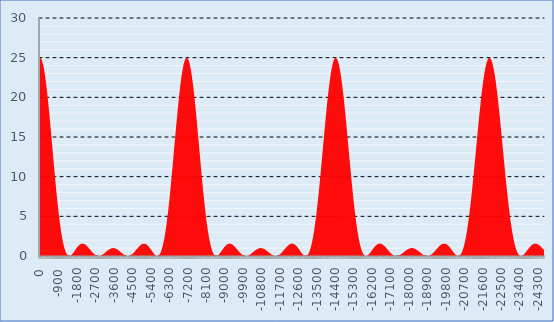
| Category | Series 0 |
|---|---|
| 0.0 | 24.999 |
| -50.0 | 24.903 |
| -100.0 | 24.615 |
| -150.0 | 24.141 |
| -200.0 | 23.489 |
| -250.0 | 22.671 |
| -300.0 | 21.702 |
| -350.0 | 20.599 |
| -400.0 | 19.38 |
| -450.0 | 18.068 |
| -500.0 | 16.683 |
| -550.0 | 15.249 |
| -600.0 | 13.789 |
| -650.0 | 12.325 |
| -700.0 | 10.879 |
| -750.0 | 9.473 |
| -800.0 | 8.124 |
| -850.0 | 6.85 |
| -900.0 | 5.666 |
| -950.0 | 4.583 |
| -1000.0 | 3.611 |
| -1050.0 | 2.756 |
| -1100.0 | 2.022 |
| -1150.0 | 1.41 |
| -1200.0 | 0.916 |
| -1250.0 | 0.537 |
| -1300.0 | 0.267 |
| -1350.0 | 0.095 |
| -1400.0 | 0.012 |
| -1450.0 | 0.007 |
| -1500.0 | 0.065 |
| -1550.0 | 0.175 |
| -1600.0 | 0.323 |
| -1650.0 | 0.497 |
| -1700.0 | 0.683 |
| -1750.0 | 0.87 |
| -1800.0 | 1.049 |
| -1850.0 | 1.21 |
| -1900.0 | 1.346 |
| -1950.0 | 1.452 |
| -2000.0 | 1.523 |
| -2050.0 | 1.559 |
| -2100.0 | 1.558 |
| -2150.0 | 1.521 |
| -2200.0 | 1.452 |
| -2250.0 | 1.355 |
| -2300.0 | 1.234 |
| -2350.0 | 1.095 |
| -2400.0 | 0.944 |
| -2450.0 | 0.787 |
| -2500.0 | 0.632 |
| -2550.0 | 0.484 |
| -2600.0 | 0.349 |
| -2650.0 | 0.231 |
| -2700.0 | 0.135 |
| -2750.0 | 0.063 |
| -2800.0 | 0.018 |
| -2850.0 | 0 |
| -2900.0 | 0.009 |
| -2950.0 | 0.043 |
| -3000.0 | 0.1 |
| -3050.0 | 0.176 |
| -3100.0 | 0.268 |
| -3150.0 | 0.37 |
| -3200.0 | 0.478 |
| -3250.0 | 0.586 |
| -3300.0 | 0.69 |
| -3350.0 | 0.785 |
| -3400.0 | 0.867 |
| -3450.0 | 0.931 |
| -3500.0 | 0.975 |
| -3550.0 | 0.997 |
| -3600.0 | 0.997 |
| -3650.0 | 0.973 |
| -3700.0 | 0.928 |
| -3750.0 | 0.863 |
| -3800.0 | 0.781 |
| -3850.0 | 0.685 |
| -3900.0 | 0.581 |
| -3950.0 | 0.472 |
| -4000.0 | 0.365 |
| -4050.0 | 0.263 |
| -4100.0 | 0.172 |
| -4150.0 | 0.097 |
| -4200.0 | 0.041 |
| -4250.0 | 0.008 |
| -4300.0 | 0.001 |
| -4350.0 | 0.02 |
| -4400.0 | 0.066 |
| -4450.0 | 0.138 |
| -4500.0 | 0.235 |
| -4550.0 | 0.353 |
| -4600.0 | 0.488 |
| -4650.0 | 0.636 |
| -4700.0 | 0.791 |
| -4750.0 | 0.947 |
| -4800.0 | 1.097 |
| -4850.0 | 1.236 |
| -4900.0 | 1.356 |
| -4950.0 | 1.453 |
| -5000.0 | 1.522 |
| -5050.0 | 1.558 |
| -5100.0 | 1.559 |
| -5150.0 | 1.523 |
| -5200.0 | 1.452 |
| -5250.0 | 1.347 |
| -5300.0 | 1.212 |
| -5350.0 | 1.052 |
| -5400.0 | 0.874 |
| -5450.0 | 0.687 |
| -5500.0 | 0.502 |
| -5550.0 | 0.329 |
| -5600.0 | 0.18 |
| -5650.0 | 0.069 |
| -5700.0 | 0.008 |
| -5750.0 | 0.01 |
| -5800.0 | 0.088 |
| -5850.0 | 0.254 |
| -5900.0 | 0.517 |
| -5950.0 | 0.886 |
| -6000.0 | 1.369 |
| -6050.0 | 1.969 |
| -6100.0 | 2.69 |
| -6150.0 | 3.529 |
| -6200.0 | 4.485 |
| -6250.0 | 5.552 |
| -6300.0 | 6.719 |
| -6350.0 | 7.976 |
| -6400.0 | 9.309 |
| -6450.0 | 10.701 |
| -6500.0 | 12.134 |
| -6550.0 | 13.587 |
| -6600.0 | 15.04 |
| -6650.0 | 16.47 |
| -6700.0 | 17.854 |
| -6750.0 | 19.171 |
| -6800.0 | 20.399 |
| -6850.0 | 21.516 |
| -6900.0 | 22.503 |
| -6950.0 | 23.345 |
| -7000.0 | 24.025 |
| -7050.0 | 24.532 |
| -7100.0 | 24.857 |
| -7150.0 | 24.995 |
| -7200.0 | 24.942 |
| -7250.0 | 24.7 |
| -7300.0 | 24.273 |
| -7350.0 | 23.67 |
| -7400.0 | 22.9 |
| -7450.0 | 21.977 |
| -7500.0 | 20.917 |
| -7550.0 | 19.739 |
| -7600.0 | 18.462 |
| -7650.0 | 17.108 |
| -7700.0 | 15.7 |
| -7750.0 | 14.258 |
| -7800.0 | 12.806 |
| -7850.0 | 11.365 |
| -7900.0 | 9.956 |
| -7950.0 | 8.597 |
| -8000.0 | 7.307 |
| -8050.0 | 6.099 |
| -8100.0 | 4.988 |
| -8150.0 | 3.981 |
| -8200.0 | 3.088 |
| -8250.0 | 2.312 |
| -8300.0 | 1.655 |
| -8350.0 | 1.116 |
| -8400.0 | 0.692 |
| -8450.0 | 0.377 |
| -8500.0 | 0.163 |
| -8550.0 | 0.041 |
| -8600.0 | 0 |
| -8650.0 | 0.029 |
| -8700.0 | 0.114 |
| -8750.0 | 0.242 |
| -8800.0 | 0.402 |
| -8850.0 | 0.581 |
| -8900.0 | 0.767 |
| -8950.0 | 0.95 |
| -9000.0 | 1.12 |
| -9050.0 | 1.269 |
| -9100.0 | 1.392 |
| -9150.0 | 1.484 |
| -9200.0 | 1.541 |
| -9250.0 | 1.563 |
| -9300.0 | 1.549 |
| -9350.0 | 1.501 |
| -9400.0 | 1.423 |
| -9450.0 | 1.319 |
| -9500.0 | 1.193 |
| -9550.0 | 1.052 |
| -9600.0 | 0.9 |
| -9650.0 | 0.746 |
| -9700.0 | 0.594 |
| -9750.0 | 0.45 |
| -9800.0 | 0.321 |
| -9850.0 | 0.209 |
| -9900.0 | 0.119 |
| -9950.0 | 0.053 |
| -10000.0 | 0.013 |
| -10050.0 | 0 |
| -10100.0 | 0.013 |
| -10150.0 | 0.049 |
| -10200.0 | 0.108 |
| -10250.0 | 0.185 |
| -10300.0 | 0.276 |
| -10350.0 | 0.378 |
| -10400.0 | 0.484 |
| -10450.0 | 0.591 |
| -10500.0 | 0.693 |
| -10550.0 | 0.787 |
| -10600.0 | 0.867 |
| -10650.0 | 0.93 |
| -10700.0 | 0.974 |
| -10750.0 | 0.997 |
| -10800.0 | 0.998 |
| -10850.0 | 0.976 |
| -10900.0 | 0.933 |
| -10950.0 | 0.871 |
| -11000.0 | 0.791 |
| -11050.0 | 0.699 |
| -11100.0 | 0.597 |
| -11150.0 | 0.491 |
| -11200.0 | 0.385 |
| -11250.0 | 0.283 |
| -11300.0 | 0.191 |
| -11350.0 | 0.113 |
| -11400.0 | 0.053 |
| -11450.0 | 0.015 |
| -11500.0 | 0 |
| -11550.0 | 0.011 |
| -11600.0 | 0.048 |
| -11650.0 | 0.111 |
| -11700.0 | 0.198 |
| -11750.0 | 0.307 |
| -11800.0 | 0.434 |
| -11850.0 | 0.575 |
| -11900.0 | 0.725 |
| -11950.0 | 0.879 |
| -12000.0 | 1.03 |
| -12050.0 | 1.172 |
| -12100.0 | 1.3 |
| -12150.0 | 1.407 |
| -12200.0 | 1.489 |
| -12250.0 | 1.542 |
| -12300.0 | 1.563 |
| -12350.0 | 1.548 |
| -12400.0 | 1.499 |
| -12450.0 | 1.416 |
| -12500.0 | 1.302 |
| -12550.0 | 1.16 |
| -12600.0 | 0.996 |
| -12650.0 | 0.818 |
| -12700.0 | 0.634 |
| -12750.0 | 0.455 |
| -12800.0 | 0.29 |
| -12850.0 | 0.151 |
| -12900.0 | 0.052 |
| -12950.0 | 0.003 |
| -13000.0 | 0.018 |
| -13050.0 | 0.107 |
| -13100.0 | 0.281 |
| -13150.0 | 0.55 |
| -13200.0 | 0.922 |
| -13250.0 | 1.403 |
| -13300.0 | 1.997 |
| -13350.0 | 2.706 |
| -13400.0 | 3.53 |
| -13450.0 | 4.465 |
| -13500.0 | 5.506 |
| -13550.0 | 6.643 |
| -13600.0 | 7.868 |
| -13650.0 | 9.166 |
| -13700.0 | 10.523 |
| -13750.0 | 11.92 |
| -13800.0 | 13.341 |
| -13850.0 | 14.764 |
| -13900.0 | 16.169 |
| -13950.0 | 17.535 |
| -14000.0 | 18.841 |
| -14050.0 | 20.067 |
| -14100.0 | 21.192 |
| -14150.0 | 22.199 |
| -14200.0 | 23.071 |
| -14250.0 | 23.794 |
| -14300.0 | 24.355 |
| -14350.0 | 24.745 |
| -14400.0 | 24.958 |
| -14450.0 | 24.99 |
| -14500.0 | 24.84 |
| -14550.0 | 24.512 |
| -14600.0 | 24.011 |
| -14650.0 | 23.345 |
| -14700.0 | 22.526 |
| -14750.0 | 21.568 |
| -14800.0 | 20.486 |
| -14850.0 | 19.299 |
| -14900.0 | 18.024 |
| -14950.0 | 16.684 |
| -15000.0 | 15.297 |
| -15050.0 | 13.886 |
| -15100.0 | 12.469 |
| -15150.0 | 11.069 |
| -15200.0 | 9.703 |
| -15250.0 | 8.388 |
| -15300.0 | 7.14 |
| -15350.0 | 5.974 |
| -15400.0 | 4.899 |
| -15450.0 | 3.926 |
| -15500.0 | 3.06 |
| -15550.0 | 2.306 |
| -15600.0 | 1.665 |
| -15650.0 | 1.137 |
| -15700.0 | 0.717 |
| -15750.0 | 0.402 |
| -15800.0 | 0.184 |
| -15850.0 | 0.054 |
| -15900.0 | 0.002 |
| -15950.0 | 0.018 |
| -16000.0 | 0.09 |
| -16050.0 | 0.207 |
| -16100.0 | 0.356 |
| -16150.0 | 0.526 |
| -16200.0 | 0.706 |
| -16250.0 | 0.886 |
| -16300.0 | 1.057 |
| -16350.0 | 1.211 |
| -16400.0 | 1.342 |
| -16450.0 | 1.445 |
| -16500.0 | 1.517 |
| -16550.0 | 1.556 |
| -16600.0 | 1.561 |
| -16650.0 | 1.532 |
| -16700.0 | 1.474 |
| -16750.0 | 1.387 |
| -16800.0 | 1.278 |
| -16850.0 | 1.15 |
| -16900.0 | 1.009 |
| -16950.0 | 0.861 |
| -17000.0 | 0.711 |
| -17050.0 | 0.564 |
| -17100.0 | 0.427 |
| -17150.0 | 0.303 |
| -17200.0 | 0.197 |
| -17250.0 | 0.112 |
| -17300.0 | 0.05 |
| -17350.0 | 0.013 |
| -17400.0 | 0 |
| -17450.0 | 0.012 |
| -17500.0 | 0.047 |
| -17550.0 | 0.102 |
| -17600.0 | 0.175 |
| -17650.0 | 0.262 |
| -17700.0 | 0.359 |
| -17750.0 | 0.462 |
| -17800.0 | 0.566 |
| -17850.0 | 0.667 |
| -17900.0 | 0.76 |
| -17950.0 | 0.842 |
| -18000.0 | 0.909 |
| -18050.0 | 0.959 |
| -18100.0 | 0.99 |
| -18150.0 | 1 |
| -18200.0 | 0.989 |
| -18250.0 | 0.958 |
| -18300.0 | 0.907 |
| -18350.0 | 0.839 |
| -18400.0 | 0.757 |
| -18450.0 | 0.663 |
| -18500.0 | 0.563 |
| -18550.0 | 0.459 |
| -18600.0 | 0.357 |
| -18650.0 | 0.26 |
| -18700.0 | 0.174 |
| -18750.0 | 0.101 |
| -18800.0 | 0.046 |
| -18850.0 | 0.012 |
| -18900.0 | 0 |
| -18950.0 | 0.012 |
| -19000.0 | 0.049 |
| -19050.0 | 0.109 |
| -19100.0 | 0.193 |
| -19150.0 | 0.296 |
| -19200.0 | 0.418 |
| -19250.0 | 0.553 |
| -19300.0 | 0.697 |
| -19350.0 | 0.845 |
| -19400.0 | 0.992 |
| -19450.0 | 1.132 |
| -19500.0 | 1.26 |
| -19550.0 | 1.371 |
| -19600.0 | 1.46 |
| -19650.0 | 1.524 |
| -19700.0 | 1.557 |
| -19750.0 | 1.56 |
| -19800.0 | 1.53 |
| -19850.0 | 1.467 |
| -19900.0 | 1.373 |
| -19950.0 | 1.252 |
| -20000.0 | 1.107 |
| -20050.0 | 0.944 |
| -20100.0 | 0.769 |
| -20150.0 | 0.592 |
| -20200.0 | 0.421 |
| -20250.0 | 0.265 |
| -20300.0 | 0.136 |
| -20350.0 | 0.045 |
| -20400.0 | 0.002 |
| -20450.0 | 0.019 |
| -20500.0 | 0.104 |
| -20550.0 | 0.27 |
| -20600.0 | 0.522 |
| -20650.0 | 0.87 |
| -20700.0 | 1.319 |
| -20750.0 | 1.872 |
| -20800.0 | 2.531 |
| -20850.0 | 3.297 |
| -20900.0 | 4.168 |
| -20950.0 | 5.138 |
| -21000.0 | 6.202 |
| -21050.0 | 7.349 |
| -21100.0 | 8.57 |
| -21150.0 | 9.852 |
| -21200.0 | 11.18 |
| -21250.0 | 12.538 |
| -21300.0 | 13.908 |
| -21350.0 | 15.274 |
| -21400.0 | 16.616 |
| -21450.0 | 17.915 |
| -21500.0 | 19.153 |
| -21550.0 | 20.312 |
| -21600.0 | 21.374 |
| -21650.0 | 22.324 |
| -21700.0 | 23.147 |
| -21750.0 | 23.83 |
| -21800.0 | 24.364 |
| -21850.0 | 24.739 |
| -21900.0 | 24.95 |
| -21950.0 | 24.995 |
| -22000.0 | 24.871 |
| -22050.0 | 24.582 |
| -22100.0 | 24.132 |
| -22150.0 | 23.529 |
| -22200.0 | 22.781 |
| -22250.0 | 21.901 |
| -22300.0 | 20.902 |
| -22350.0 | 19.799 |
| -22400.0 | 18.609 |
| -22450.0 | 17.349 |
| -22500.0 | 16.038 |
| -22550.0 | 14.694 |
| -22600.0 | 13.334 |
| -22650.0 | 11.979 |
| -22700.0 | 10.643 |
| -22750.0 | 9.345 |
| -22800.0 | 8.098 |
| -22850.0 | 6.916 |
| -22900.0 | 5.811 |
| -22950.0 | 4.792 |
| -23000.0 | 3.867 |
| -23050.0 | 3.042 |
| -23100.0 | 2.319 |
| -23150.0 | 1.7 |
| -23200.0 | 1.185 |
| -23250.0 | 0.771 |
| -23300.0 | 0.453 |
| -23350.0 | 0.225 |
| -23400.0 | 0.08 |
| -23450.0 | 0.01 |
| -23500.0 | 0.006 |
| -23550.0 | 0.056 |
| -23600.0 | 0.151 |
| -23650.0 | 0.281 |
| -23700.0 | 0.435 |
| -23750.0 | 0.603 |
| -23800.0 | 0.777 |
| -23850.0 | 0.947 |
| -23900.0 | 1.106 |
| -23950.0 | 1.248 |
| -24000.0 | 1.368 |
| -24050.0 | 1.461 |
| -24100.0 | 1.524 |
| -24150.0 | 1.558 |
| -24200.0 | 1.56 |
| -24250.0 | 1.532 |
| -24300.0 | 1.477 |
| -24350.0 | 1.396 |
| -24400.0 | 1.293 |
| -24450.0 | 1.173 |
| -24500.0 | 1.04 |
| -24550.0 | 0.9 |
| -24600.0 | 0.756 |
| -24650.0 | 0.615 |